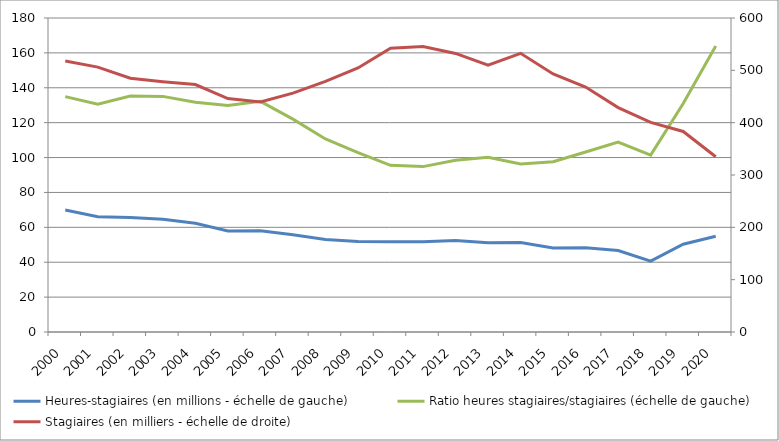
| Category | Heures-stagiaires (en millions - échelle de gauche) | Ratio heures stagiaires/stagiaires (échelle de gauche) |
|---|---|---|
| 2000.0 | 69.9 | 134.942 |
| 2001.0 | 66.1 | 130.607 |
| 2002.0 | 65.6 | 135.286 |
| 2003.0 | 64.6 | 135.062 |
| 2004.0 | 62.3 | 131.74 |
| 2005.0 | 57.9 | 129.792 |
| 2006.0 | 58.1 | 132.226 |
| 2007.0 | 55.7 | 122.015 |
| 2008.0 | 53 | 110.647 |
| 2009.0 | 51.9 | 102.874 |
| 2010.0 | 51.8 | 95.537 |
| 2011.0 | 51.7 | 94.81 |
| 2012.0 | 52.4 | 98.441 |
| 2013.0 | 51.1 | 100.216 |
| 2014.0 | 51.3 | 96.338 |
| 2015.0 | 48.106 | 97.577 |
| 2016.0 | 48.3 | 103.205 |
| 2017.0 | 46.7 | 108.909 |
| 2018.0 | 40.6 | 101.373 |
| 2019.0 | 50.3 | 131 |
| 2020.0 | 54.9 | 164 |